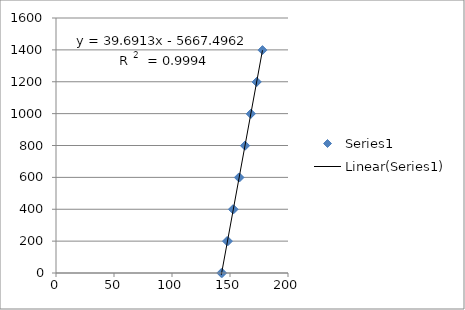
| Category | Series 0 |
|---|---|
| 142.5 | 0 |
| 147.4 | 199.8 |
| 152.5 | 399.6 |
| 157.6 | 599.4 |
| 162.8 | 799.2 |
| 167.9 | 999 |
| 172.9 | 1198.8 |
| 178.0 | 1398.6 |
| 173.1 | 1198.8 |
| 168.0 | 999 |
| 163.1 | 799.2 |
| 158.2 | 599.4 |
| 153.1 | 399.6 |
| 148.2 | 199.8 |
| 143.2 | 0 |